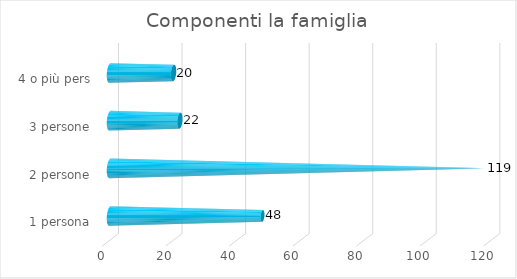
| Category | Componenti la famiglia |
|---|---|
| 1 persona | 48 |
| 2 persone | 119 |
| 3 persone | 22 |
| 4 o più pers | 20 |